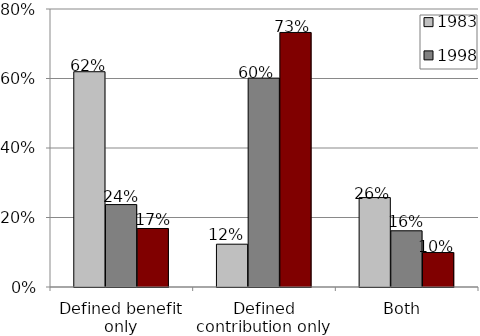
| Category | 1983 | 1998 | 2016 |
|---|---|---|---|
| Defined benefit only | 0.619 | 0.237 | 0.168 |
| Defined contribution only | 0.123 | 0.601 | 0.732 |
| Both  | 0.257 | 0.162 | 0.099 |